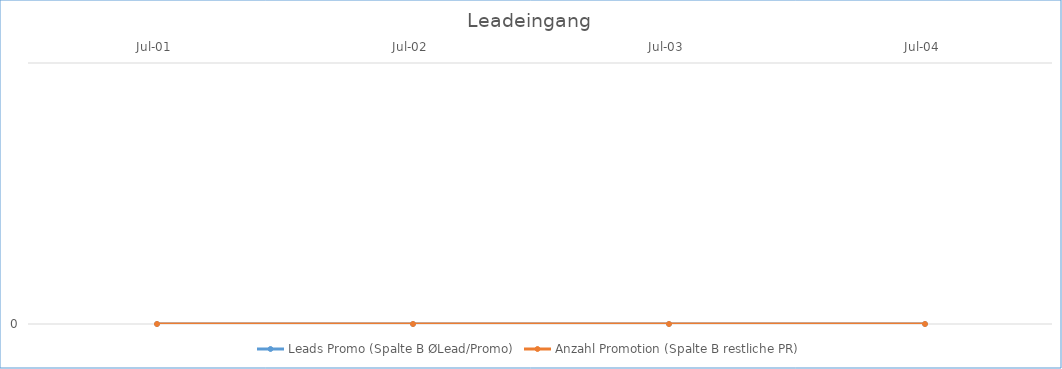
| Category | Leads Promo (Spalte B ØLead/Promo) | Anzahl Promotion (Spalte B restliche PR) |
|---|---|---|
| 2001-07-01 | 0 | 0 |
| 2002-07-01 | 0 | 0 |
| 2003-07-01 | 0 | 0 |
| 2004-07-01 | 0 | 0 |